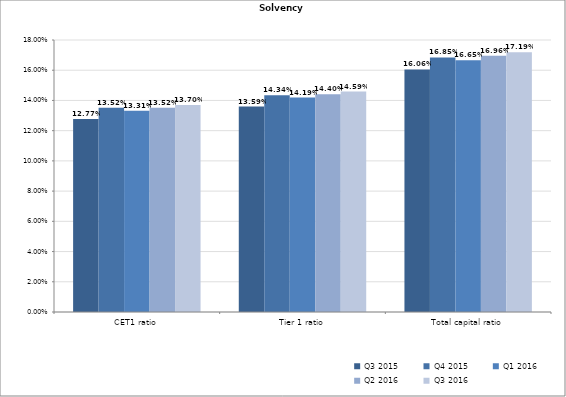
| Category | Q3 2015 | Q4 2015 | Q1 2016 | Q2 2016 | Q3 2016 |
|---|---|---|---|---|---|
| CET1 ratio | 0.128 | 0.135 | 0.133 | 0.135 | 0.137 |
| Tier 1 ratio | 0.136 | 0.143 | 0.142 | 0.144 | 0.146 |
| Total capital ratio | 0.161 | 0.168 | 0.167 | 0.17 | 0.172 |